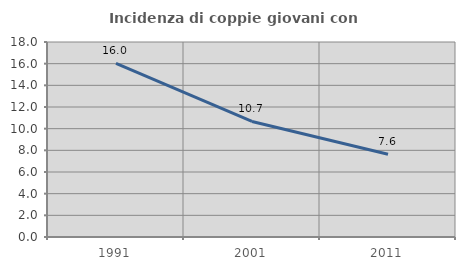
| Category | Incidenza di coppie giovani con figli |
|---|---|
| 1991.0 | 16.025 |
| 2001.0 | 10.665 |
| 2011.0 | 7.646 |